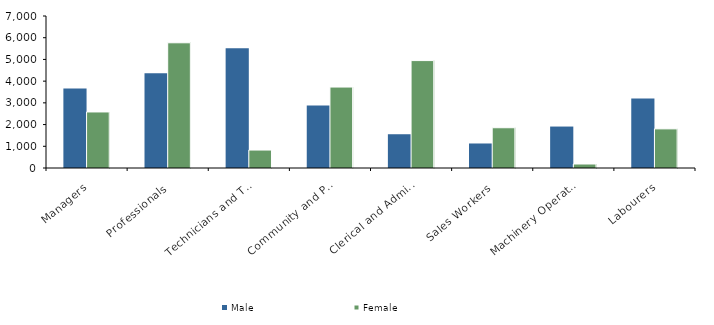
| Category | Male | Female |
|---|---|---|
| Managers | 3659 | 2581 |
| Professionals | 4360 | 5766 |
| Technicians and Trades Workers | 5515 | 827 |
| Community and Personal Service Workers | 2881 | 3728 |
| Clerical and Administrative Workers | 1555 | 4947 |
| Sales Workers | 1129 | 1854 |
| Machinery Operators and Drivers | 1909 | 184 |
| Labourers | 3205 | 1802 |